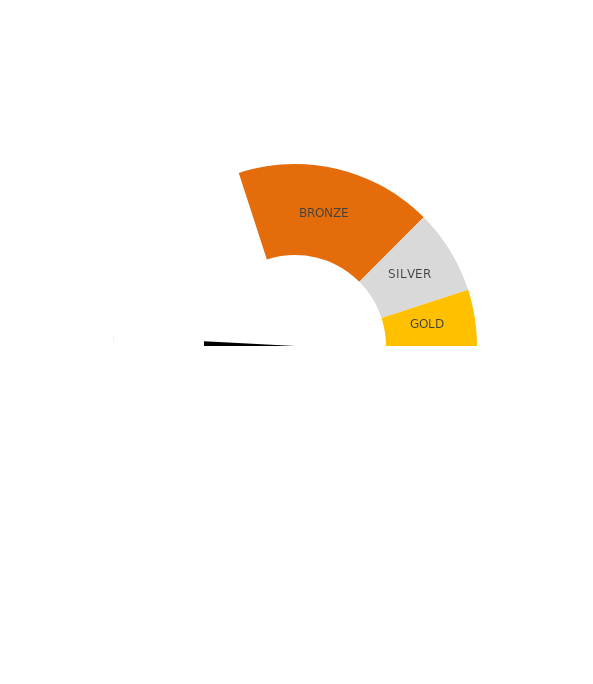
| Category | Pointer  |
|---|---|
| 0 | 0 |
| 1 | 1 |
| 2 | 119 |